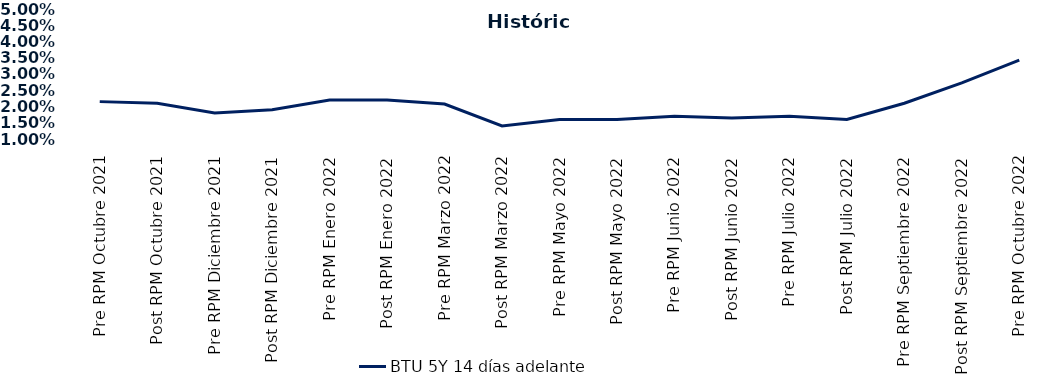
| Category | BTU 5Y 14 días adelante |
|---|---|
| Pre RPM Octubre 2021 | 0.022 |
| Post RPM Octubre 2021 | 0.021 |
| Pre RPM Diciembre 2021 | 0.018 |
| Post RPM Diciembre 2021 | 0.019 |
| Pre RPM Enero 2022 | 0.022 |
| Post RPM Enero 2022 | 0.022 |
| Pre RPM Marzo 2022 | 0.021 |
| Post RPM Marzo 2022 | 0.014 |
| Pre RPM Mayo 2022 | 0.016 |
| Post RPM Mayo 2022 | 0.016 |
| Pre RPM Junio 2022 | 0.017 |
| Post RPM Junio 2022 | 0.016 |
| Pre RPM Julio 2022 | 0.017 |
| Post RPM Julio 2022 | 0.016 |
| Pre RPM Septiembre 2022 | 0.021 |
| Post RPM Septiembre 2022 | 0.027 |
| Pre RPM Octubre 2022 | 0.034 |